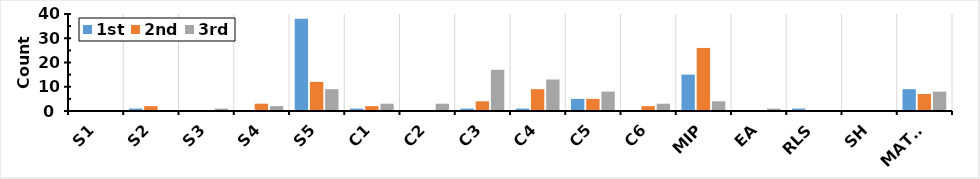
| Category | 1st | 2nd | 3rd |
|---|---|---|---|
| S1 | 0 | 0 | 0 |
| S2 | 1 | 2 | 0 |
| S3 | 0 | 0 | 1 |
| S4 | 0 | 3 | 2 |
| S5 | 38 | 12 | 9 |
| C1 | 1 | 2 | 3 |
| C2 | 0 | 0 | 3 |
| C3 | 1 | 4 | 17 |
| C4 | 1 | 9 | 13 |
| C5 | 5 | 5 | 8 |
| C6 | 0 | 2 | 3 |
| MIP | 15 | 26 | 4 |
| EA | 0 | 0 | 1 |
| RLS | 1 | 0 | 0 |
| SH | 0 | 0 | 0 |
| MATLS | 9 | 7 | 8 |